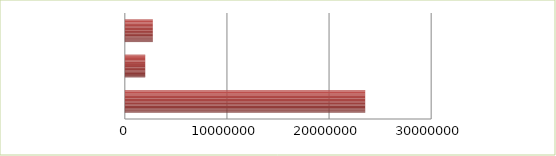
| Category | Series 0 | Series 1 |
|---|---|---|
| 0 | 2.5 | 23540500 |
| 1 | 2.6 | 2000000 |
| 2 | 2.7 | 2740090 |